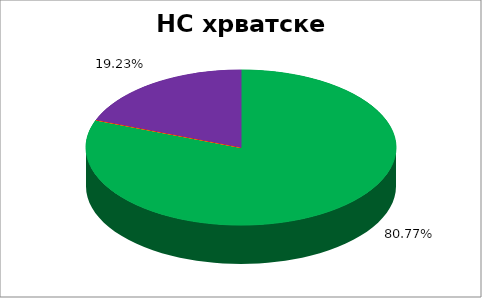
| Category | НС хрватске НМ |
|---|---|
| 0 | 0.808 |
| 1 | 0 |
| 2 | 0 |
| 3 | 0 |
| 4 | 0.192 |